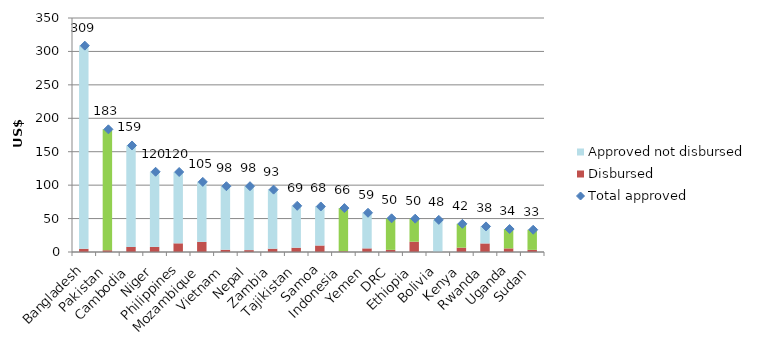
| Category | Disbursed | Approved not disbursed |
|---|---|---|
| Bangladesh | 4.82 | 303.83 |
| Pakistan | 2.64 | 180.84 |
| Cambodia | 7.63 | 151.72 |
| Niger | 7.64 | 112.35 |
| Philippines | 12.97 | 106.71 |
| Mozambique | 15.08 | 89.8 |
| Vietnam | 3.4 | 95.01 |
| Nepal | 2.84 | 95.56 |
| Zambia | 4.95 | 88.33 |
| Tajikistan | 6.43 | 62.64 |
| Samoa | 9.72 | 58.36 |
| Indonesia | 1.15 | 64.54 |
| Yemen | 5.42 | 53.28 |
| DRC | 3.2 | 47.17 |
| Ethiopia | 15.4 | 34.42 |
| Bolivia | 0.19 | 47.87 |
| Kenya | 6.5 | 35.62 |
| Rwanda | 12.8 | 25.47 |
| Uganda | 5.41 | 28.94 |
| Sudan | 3.2 | 30.07 |